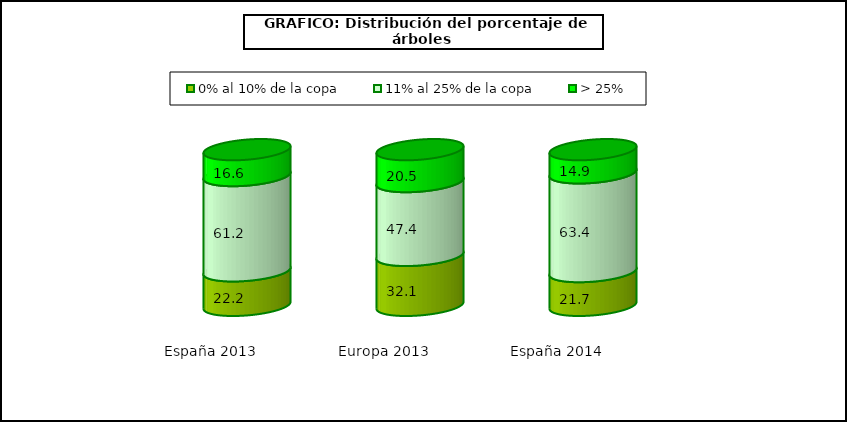
| Category | 0% al 10% de la copa | 11% al 25% de la copa | > 25% |
|---|---|---|---|
| España 2013 | 22.171 | 61.19 | 16.64 |
| Europa 2013 | 32.1 | 47.4 | 20.5 |
| España 2014 | 21.7 | 63.4 | 14.9 |